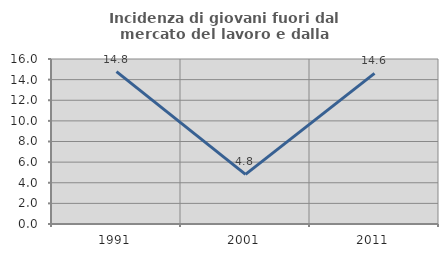
| Category | Incidenza di giovani fuori dal mercato del lavoro e dalla formazione  |
|---|---|
| 1991.0 | 14.783 |
| 2001.0 | 4.808 |
| 2011.0 | 14.607 |